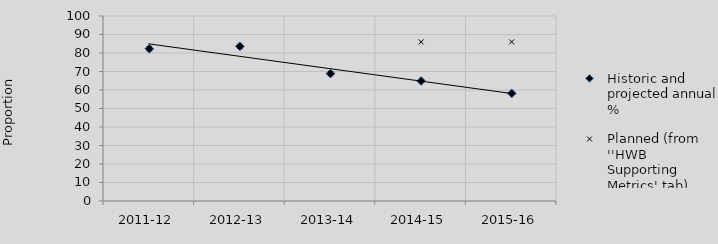
| Category | Historic and projected annual % | Planned (from ''HWB Supporting Metrics' tab) |
|---|---|---|
| 2011-12 | 82.3 | 82.3 |
| 2012-13 | 83.6 | 83.6 |
| 2013-14 | 68.9 | 68.9 |
| 2014-15 | 64.867 | 86 |
| 2015-16 | 58.167 | 86 |